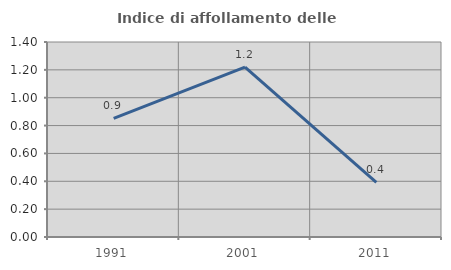
| Category | Indice di affollamento delle abitazioni  |
|---|---|
| 1991.0 | 0.851 |
| 2001.0 | 1.22 |
| 2011.0 | 0.392 |